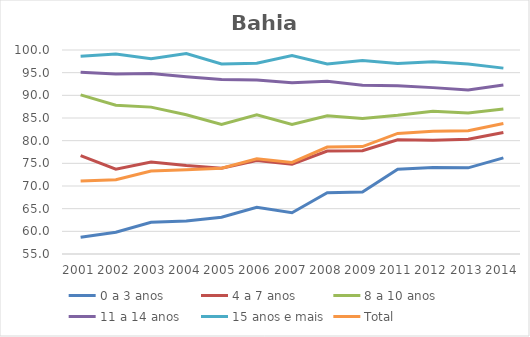
| Category | 0 a 3 anos | 4 a 7 anos | 8 a 10 anos | 11 a 14 anos | 15 anos e mais | Total |
|---|---|---|---|---|---|---|
| 2001.0 | 58.7 | 76.7 | 90.1 | 95.1 | 98.6 | 71.1 |
| 2002.0 | 59.8 | 73.7 | 87.8 | 94.7 | 99.1 | 71.4 |
| 2003.0 | 62 | 75.3 | 87.4 | 94.8 | 98.1 | 73.3 |
| 2004.0 | 62.3 | 74.5 | 85.7 | 94.1 | 99.2 | 73.6 |
| 2005.0 | 63.1 | 73.9 | 83.6 | 93.5 | 96.9 | 73.9 |
| 2006.0 | 65.3 | 75.6 | 85.7 | 93.4 | 97.1 | 76 |
| 2007.0 | 64.1 | 74.8 | 83.6 | 92.8 | 98.8 | 75.2 |
| 2008.0 | 68.5 | 77.7 | 85.5 | 93.1 | 96.9 | 78.6 |
| 2009.0 | 68.7 | 77.8 | 84.9 | 92.2 | 97.7 | 78.7 |
| 2011.0 | 73.7 | 80.2 | 85.6 | 92.1 | 97 | 81.6 |
| 2012.0 | 74.1 | 80.1 | 86.5 | 91.7 | 97.4 | 82.1 |
| 2013.0 | 74 | 80.3 | 86.1 | 91.2 | 96.9 | 82.2 |
| 2014.0 | 76.2 | 81.8 | 87 | 92.3 | 96 | 83.8 |